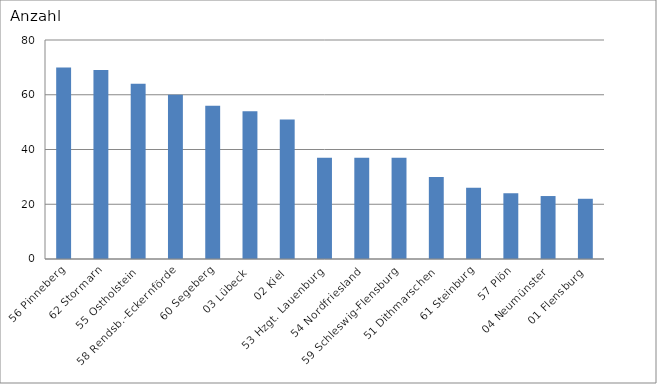
| Category | 56 Pinneberg 62 Stormarn 55 Ostholstein 58 Rendsb.-Eckernförde 60 Segeberg 03 Lübeck 02 Kiel 53 Hzgt. Lauenburg 54 Nordfriesland 59 Schleswig-Flensburg 51 Dithmarschen 61 Steinburg 57 Plön 04 Neumünster 01 Flensburg |
|---|---|
| 56 Pinneberg | 70 |
| 62 Stormarn | 69 |
| 55 Ostholstein | 64 |
| 58 Rendsb.-Eckernförde | 60 |
| 60 Segeberg | 56 |
| 03 Lübeck | 54 |
| 02 Kiel | 51 |
| 53 Hzgt. Lauenburg | 37 |
| 54 Nordfriesland | 37 |
| 59 Schleswig-Flensburg | 37 |
| 51 Dithmarschen | 30 |
| 61 Steinburg | 26 |
| 57 Plön | 24 |
| 04 Neumünster | 23 |
| 01 Flensburg | 22 |